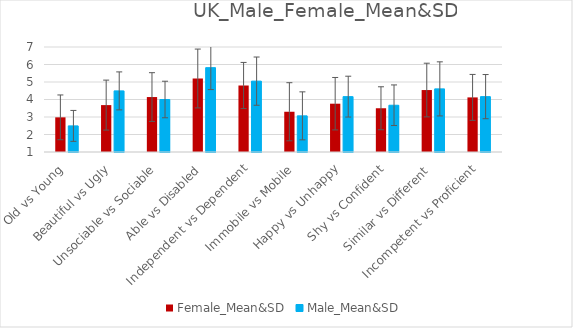
| Category | Female_Mean&SD | Male_Mean&SD |
|---|---|---|
| Old vs Young | 2.98 | 2.492 |
|  Beautiful vs Ugly | 3.68 | 4.492 |
| Unsociable vs Sociable | 4.14 | 4 |
| Able vs Disabled | 5.2 | 5.82 |
| Independent vs Dependent | 4.8 | 5.049 |
| Immobile vs Mobile | 3.3 | 3.066 |
| Happy vs Unhappy | 3.76 | 4.164 |
| Shy vs Confident | 3.5 | 3.672 |
| Similar vs Different | 4.54 | 4.607 |
| Incompetent vs Proficient | 4.12 | 4.164 |